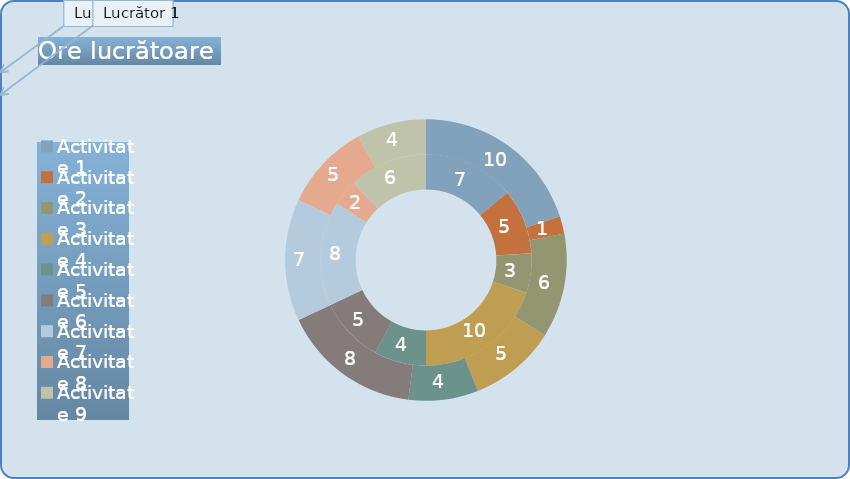
| Category | Lucrător 1 (ore) | Lucrător 2 (ore) |
|---|---|---|
| Activitate 1 | 7 | 10 |
| Activitate 2 | 5 | 1 |
| Activitate 3 | 3 | 6 |
| Activitate 4 | 10 | 5 |
| Activitate 5 | 4 | 4 |
| Activitate 6 | 5 | 8 |
| Activitate 7 | 8 | 7 |
| Activitate 8 | 2 | 5 |
| Activitate 9 | 6 | 4 |